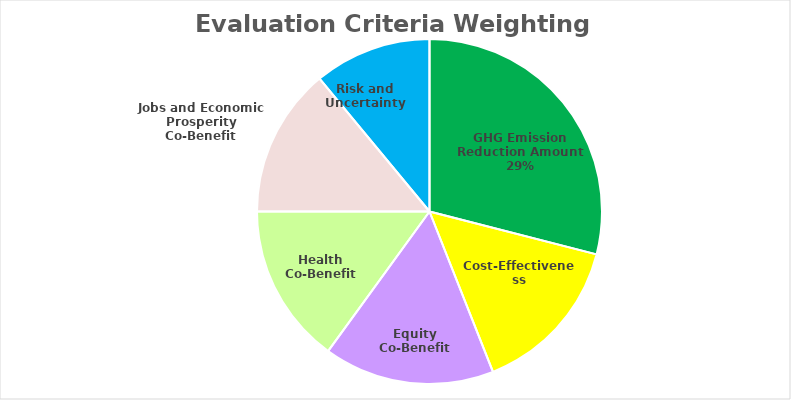
| Category | Series 0 |
|---|---|
| GHG Emission Reduction Amount | 29 |
| Cost-Effectiveness | 15 |
| Equity Co-Benefit | 16 |
| Health Co-Benefit | 15 |
| Jobs and Economic Prosperity Co-Benefit | 14 |
| Risk and Uncertainty | 11 |